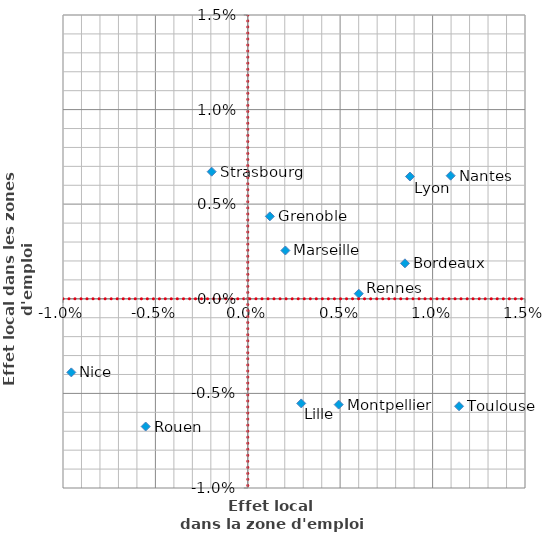
| Category | ZE contigües intrarégionales |
|---|---|
| 0.008774577484786274 | 0.006 |
| 0.0020337981210522445 | 0.003 |
| 0.010977376189982969 | 0.007 |
| 0.001194105314353368 | 0.004 |
| -0.001954612829596366 | 0.007 |
| 0.008502789202672091 | 0.002 |
| 0.006004370373896085 | 0 |
| -0.009548803633484482 | -0.004 |
| 0.004917818699786689 | -0.006 |
| 0.011430228665446367 | -0.006 |
| 0.0028915635775388047 | -0.006 |
| -0.005525632937607049 | -0.007 |